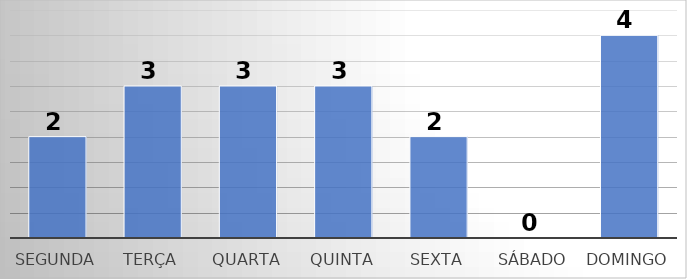
| Category | Series 0 |
|---|---|
| Segunda | 2 |
| Terça | 3 |
| Quarta | 3 |
| Quinta | 3 |
| Sexta | 2 |
| Sábado | 0 |
| Domingo | 4 |